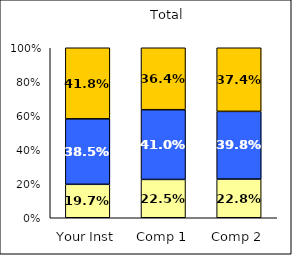
| Category | Low Overall Satisfaction | Average Overall Satisfaction | High Overall Satisfaction |
|---|---|---|---|
| Your Inst | 0.197 | 0.385 | 0.418 |
| Comp 1 | 0.225 | 0.41 | 0.364 |
| Comp 2 | 0.228 | 0.398 | 0.374 |